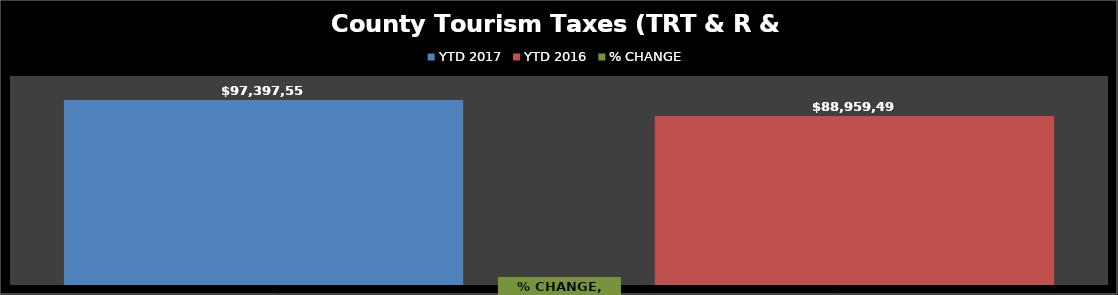
| Category | YTD 2017 | YTD 2016 |
|---|---|---|
| 0 | 97397556.04 | 88959490.071 |